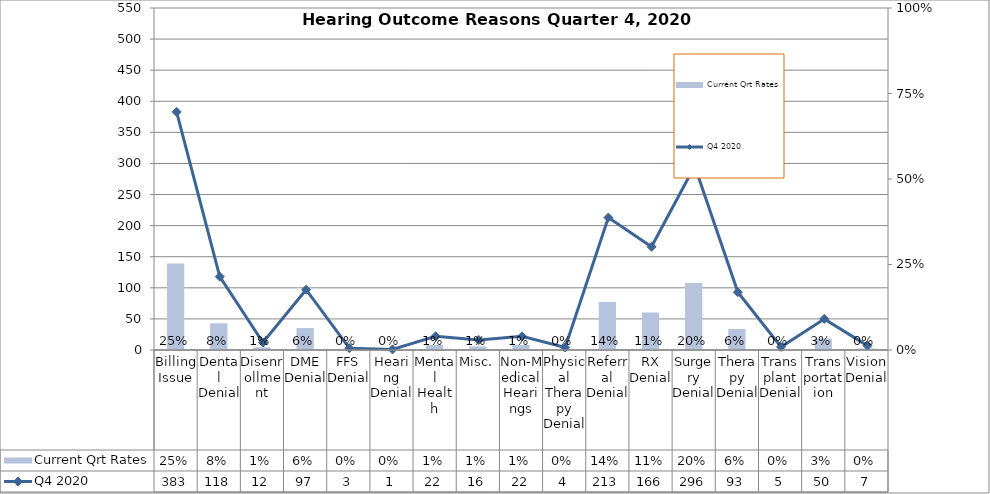
| Category | Current Qrt Rates |
|---|---|
| Billing Issue | 0.253 |
| Dental Denial | 0.078 |
| Disenrollment | 0.008 |
| DME Denial | 0.064 |
| FFS Denial | 0.002 |
| Hearing Denial | 0.001 |
| Mental Health | 0.015 |
| Misc. | 0.011 |
| Non-Medical Hearings | 0.015 |
| Physical Therapy Denial | 0.003 |
| Referral Denial | 0.141 |
| RX Denial | 0.11 |
| Surgery Denial | 0.196 |
| Therapy Denial | 0.061 |
| Transplant Denial | 0.003 |
| Transportation | 0.033 |
| Vision Denial | 0.005 |